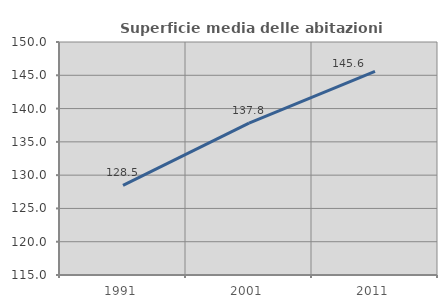
| Category | Superficie media delle abitazioni occupate |
|---|---|
| 1991.0 | 128.457 |
| 2001.0 | 137.815 |
| 2011.0 | 145.593 |